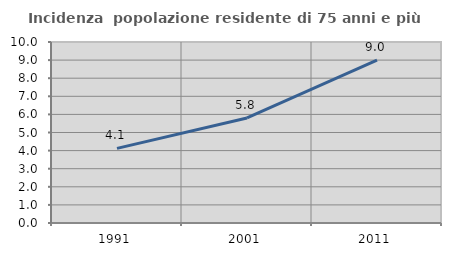
| Category | Incidenza  popolazione residente di 75 anni e più |
|---|---|
| 1991.0 | 4.124 |
| 2001.0 | 5.806 |
| 2011.0 | 8.993 |